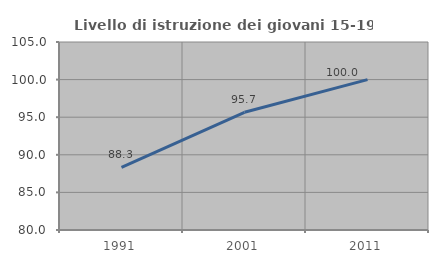
| Category | Livello di istruzione dei giovani 15-19 anni |
|---|---|
| 1991.0 | 88.333 |
| 2001.0 | 95.652 |
| 2011.0 | 100 |